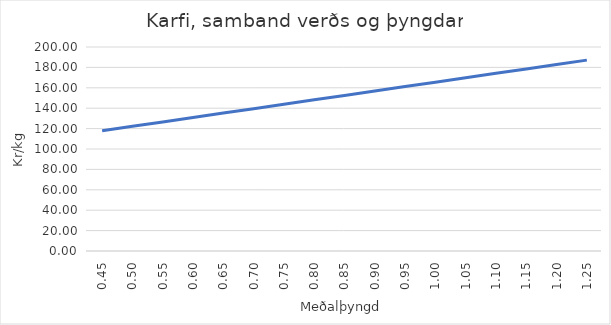
| Category | Series 0 |
|---|---|
| 0.45 | 117.889 |
| 0.5 | 122.217 |
| 0.55 | 126.546 |
| 0.6 | 130.874 |
| 0.65 | 135.203 |
| 0.7 | 139.531 |
| 0.75 | 143.86 |
| 0.8 | 148.188 |
| 0.85 | 152.517 |
| 0.9 | 156.845 |
| 0.95 | 161.174 |
| 1.0 | 165.502 |
| 1.05 | 169.831 |
| 1.1 | 174.159 |
| 1.15 | 178.488 |
| 1.2 | 182.816 |
| 1.25 | 187.145 |